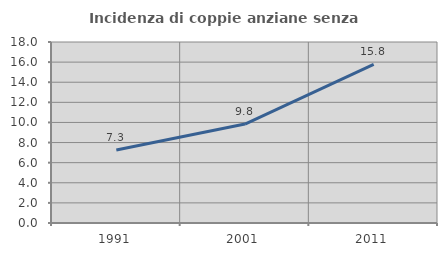
| Category | Incidenza di coppie anziane senza figli  |
|---|---|
| 1991.0 | 7.265 |
| 2001.0 | 9.837 |
| 2011.0 | 15.773 |